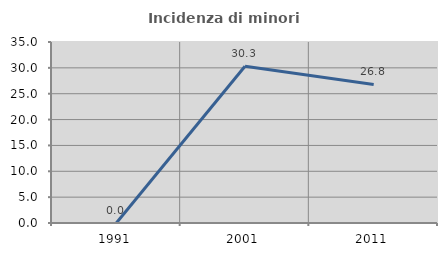
| Category | Incidenza di minori stranieri |
|---|---|
| 1991.0 | 0 |
| 2001.0 | 30.303 |
| 2011.0 | 26.786 |